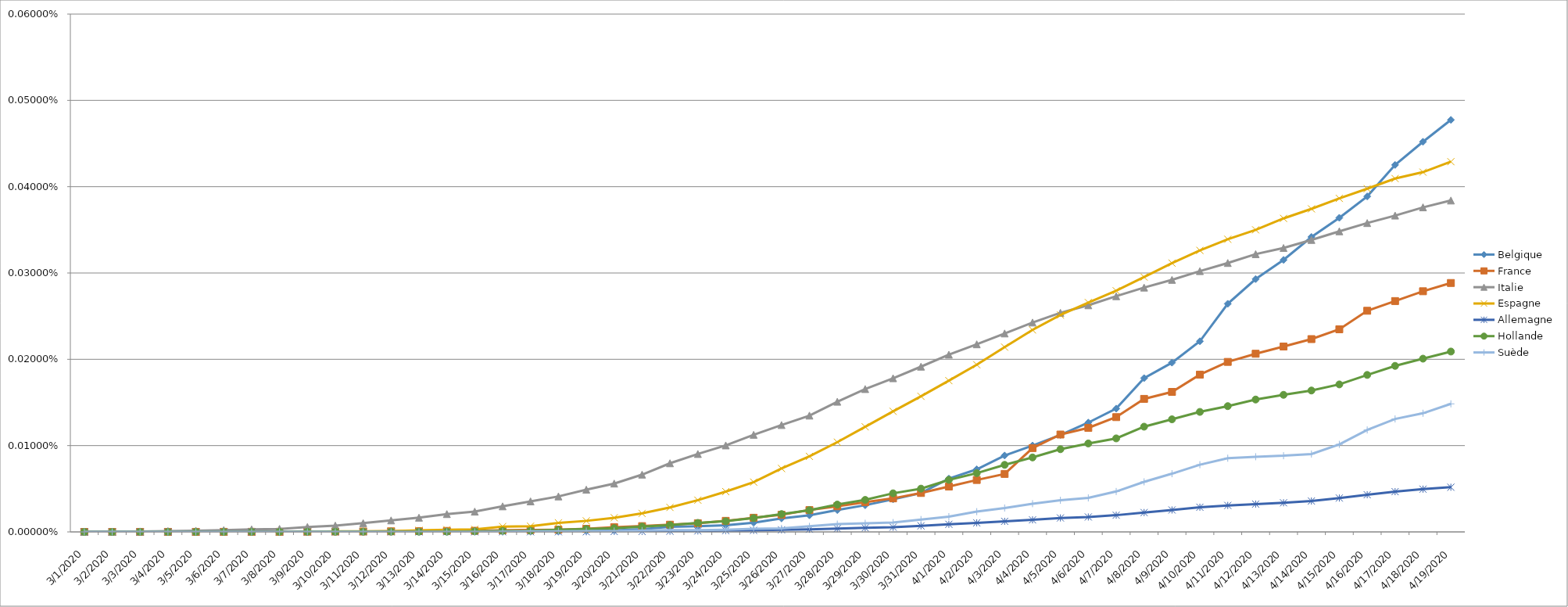
| Category | Belgique | France | Italie | Espagne | Allemagne | Hollande | Suède |
|---|---|---|---|---|---|---|---|
| 3/1/20 | 0 | 0 | 0 | 0 | 0 | 0 | 0 |
| 3/2/20 | 0 | 0 | 0 | 0 | 0 | 0 | 0 |
| 3/3/20 | 0 | 0 | 0 | 0 | 0 | 0 | 0 |
| 3/4/20 | 0 | 0 | 0 | 0 | 0 | 0 | 0 |
| 3/5/20 | 0 | 0 | 0 | 0 | 0 | 0 | 0 |
| 3/6/20 | 0 | 0 | 0 | 0 | 0 | 0 | 0 |
| 3/7/20 | 0 | 0 | 0 | 0 | 0 | 0 | 0 |
| 3/8/20 | 0 | 0 | 0 | 0 | 0 | 0 | 0 |
| 3/9/20 | 0 | 0 | 0 | 0 | 0 | 0 | 0 |
| 3/10/20 | 0 | 0 | 0 | 0 | 0 | 0 | 0 |
| 3/11/20 | 0 | 0 | 0 | 0 | 0 | 0 | 0 |
| 3/12/20 | 0 | 0 | 0 | 0 | 0 | 0 | 0 |
| 3/13/20 | 0 | 0 | 0 | 0 | 0 | 0 | 0 |
| 3/14/20 | 0 | 0 | 0 | 0 | 0 | 0 | 0 |
| 3/15/20 | 0 | 0 | 0 | 0 | 0 | 0 | 0 |
| 3/16/20 | 0 | 0 | 0 | 0 | 0 | 0 | 0 |
| 3/17/20 | 0 | 0 | 0 | 0 | 0 | 0 | 0 |
| 3/18/20 | 0 | 0 | 0 | 0 | 0 | 0 | 0 |
| 3/19/20 | 0 | 0 | 0 | 0 | 0 | 0 | 0 |
| 3/20/20 | 0 | 0 | 0 | 0 | 0 | 0 | 0 |
| 3/21/20 | 0 | 0 | 0 | 0 | 0 | 0 | 0 |
| 3/22/20 | 0 | 0 | 0 | 0 | 0 | 0 | 0 |
| 3/23/20 | 0 | 0 | 0 | 0 | 0 | 0 | 0 |
| 3/24/20 | 0 | 0 | 0 | 0 | 0 | 0 | 0 |
| 3/25/20 | 0 | 0 | 0 | 0 | 0 | 0 | 0 |
| 3/26/20 | 0 | 0 | 0 | 0 | 0 | 0 | 0 |
| 3/27/20 | 0 | 0 | 0 | 0 | 0 | 0 | 0 |
| 3/28/20 | 0 | 0 | 0 | 0 | 0 | 0 | 0 |
| 3/29/20 | 0 | 0 | 0 | 0 | 0 | 0 | 0 |
| 3/30/20 | 0 | 0 | 0 | 0 | 0 | 0 | 0 |
| 3/31/20 | 0 | 0 | 0 | 0 | 0 | 0 | 0 |
| 4/1/20 | 0 | 0 | 0 | 0 | 0 | 0 | 0 |
| 4/2/20 | 0 | 0 | 0 | 0 | 0 | 0 | 0 |
| 4/3/20 | 0 | 0 | 0 | 0 | 0 | 0 | 0 |
| 4/4/20 | 0 | 0 | 0 | 0 | 0 | 0 | 0 |
| 4/5/20 | 0 | 0 | 0 | 0 | 0 | 0 | 0 |
| 4/6/20 | 0 | 0 | 0 | 0 | 0 | 0 | 0 |
| 4/7/20 | 0 | 0 | 0 | 0 | 0 | 0 | 0 |
| 4/8/20 | 0 | 0 | 0 | 0 | 0 | 0 | 0 |
| 4/9/20 | 0 | 0 | 0 | 0 | 0 | 0 | 0 |
| 4/10/20 | 0 | 0 | 0 | 0 | 0 | 0 | 0 |
| 4/11/20 | 0 | 0 | 0 | 0 | 0 | 0 | 0 |
| 4/12/20 | 0 | 0 | 0 | 0 | 0 | 0 | 0 |
| 4/13/20 | 0 | 0 | 0 | 0 | 0 | 0 | 0 |
| 4/14/20 | 0 | 0 | 0 | 0 | 0 | 0 | 0 |
| 4/15/20 | 0 | 0 | 0 | 0 | 0 | 0 | 0 |
| 4/16/20 | 0 | 0 | 0 | 0 | 0 | 0 | 0 |
| 4/17/20 | 0 | 0 | 0 | 0 | 0 | 0 | 0 |
| 4/18/20 | 0 | 0 | 0 | 0 | 0 | 0 | 0 |
| 4/19/20 | 0 | 0 | 0 | 0 | 0 | 0 | 0 |